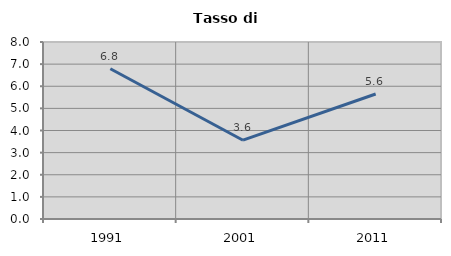
| Category | Tasso di disoccupazione   |
|---|---|
| 1991.0 | 6.793 |
| 2001.0 | 3.561 |
| 2011.0 | 5.65 |